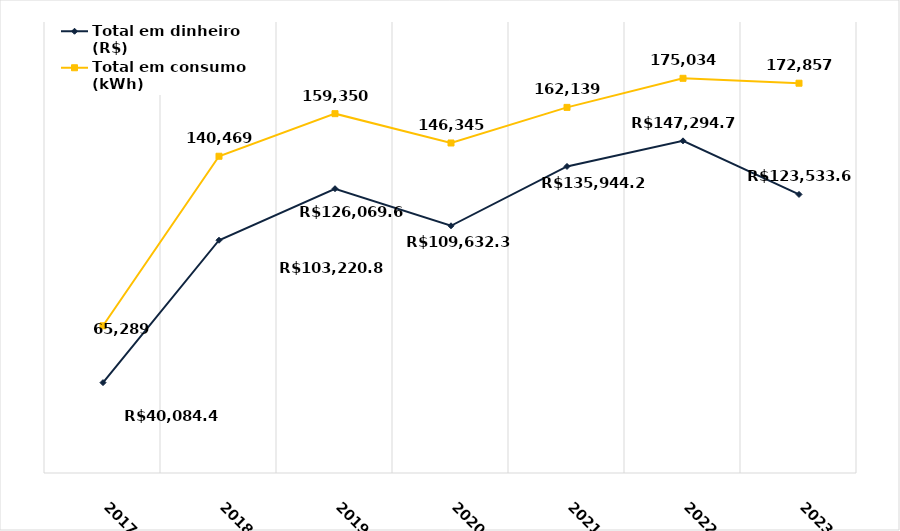
| Category | Total em dinheiro (R$) | Total em consumo (kWh) |
|---|---|---|
| 2017.0 | 40084.49 | 65289 |
| 2018.0 | 103220.86 | 140469 |
| 2019.0 | 126069.66 | 159350 |
| 2020.0 | 109632.34 | 146345 |
| 2021.0 | 135944.28 | 162139 |
| 2022.0 | 147294.73 | 175034 |
| 2023.0 | 123533.67 | 172857 |